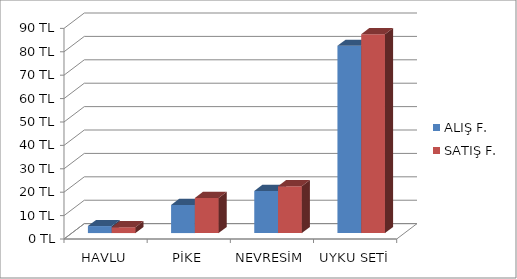
| Category | ALIŞ F. | SATIŞ F. |
|---|---|---|
| HAVLU | 3 | 2.5 |
| PİKE | 12 | 15 |
| NEVRESİM | 18 | 20 |
| UYKU SETİ | 80 | 85 |